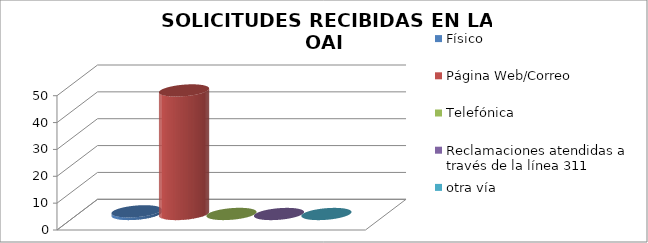
| Category | Físico | Página Web/Correo | Telefónica | Reclamaciones atendidas a través de la línea 311 | otra vía |
|---|---|---|---|---|---|
| 0 | 1 | 46 | 0.021 | 0 | 0 |